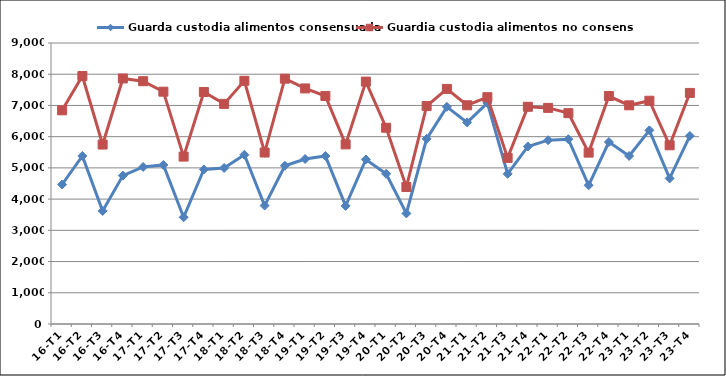
| Category | Guarda custodia alimentos consensuada | Guardia custodia alimentos no consensuada |
|---|---|---|
| 16-T1 | 4468 | 6844 |
| 16-T2 | 5382 | 7942 |
| 16-T3 | 3622 | 5748 |
| 16-T4 | 4753 | 7864 |
| 17-T1 | 5030 | 7776 |
| 17-T2 | 5094 | 7441 |
| 17-T3 | 3417 | 5362 |
| 17-T4 | 4951 | 7432 |
| 18-T1 | 4998 | 7050 |
| 18-T2 | 5420 | 7789 |
| 18-T3 | 3793 | 5492 |
| 18-T4 | 5070 | 7857 |
| 19-T1 | 5285 | 7545 |
| 19-T2 | 5380 | 7303 |
| 19-T3 | 3782 | 5753 |
| 19-T4 | 5269 | 7763 |
| 20-T1 | 4809 | 6286 |
| 20-T2 | 3542 | 4387 |
| 20-T3 | 5930 | 6981 |
| 20-T4 | 6955 | 7530 |
| 21-T1 | 6456 | 7006 |
| 21-T2 | 7080 | 7264 |
| 21-T3 | 4810 | 5320 |
| 21-T4 | 5686 | 6958 |
| 22-T1 | 5888 | 6922 |
| 22-T2 | 5919 | 6753 |
| 22-T3 | 4443 | 5489 |
| 22-T4 | 5827 | 7302 |
| 23-T1 | 5382 | 7004 |
| 23-T2 | 6202 | 7151 |
| 23-T3 | 4664 | 5724 |
| 23-T4 | 6025 | 7401 |